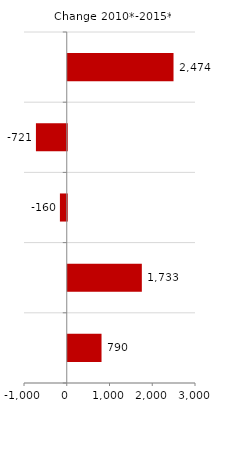
| Category | Difference |
|---|---|
| 0 | 3889 |
| 1 | 7520 |
| 2 | 667 |
| 3 | 7597 |
| 4 | 2835 |